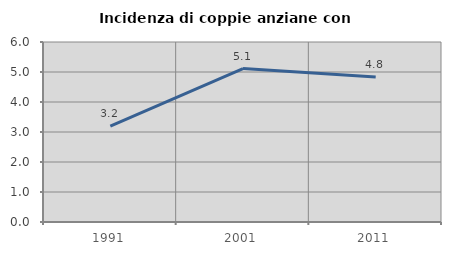
| Category | Incidenza di coppie anziane con figli |
|---|---|
| 1991.0 | 3.198 |
| 2001.0 | 5.115 |
| 2011.0 | 4.835 |